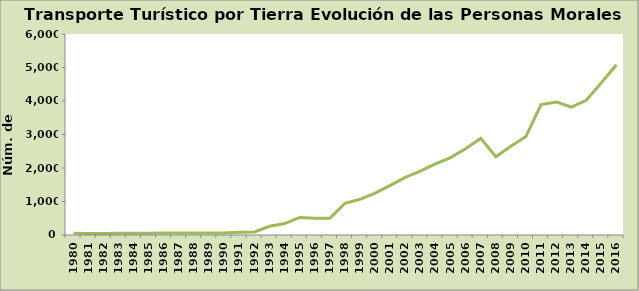
| Category | Series 0 |
|---|---|
| 1980.0 | 50 |
| 1981.0 | 44 |
| 1982.0 | 46 |
| 1983.0 | 54 |
| 1984.0 | 54 |
| 1985.0 | 51 |
| 1986.0 | 56 |
| 1987.0 | 56 |
| 1988.0 | 58 |
| 1989.0 | 60 |
| 1990.0 | 60 |
| 1991.0 | 85 |
| 1992.0 | 90 |
| 1993.0 | 261 |
| 1994.0 | 342 |
| 1995.0 | 523 |
| 1996.0 | 498 |
| 1997.0 | 503 |
| 1998.0 | 948 |
| 1999.0 | 1065 |
| 2000.0 | 1248 |
| 2001.0 | 1483 |
| 2002.0 | 1722 |
| 2003.0 | 1904 |
| 2004.0 | 2120 |
| 2005.0 | 2311 |
| 2006.0 | 2577 |
| 2007.0 | 2888 |
| 2008.0 | 2338 |
| 2009.0 | 2649 |
| 2010.0 | 2942 |
| 2011.0 | 3895 |
| 2012.0 | 3972 |
| 2013.0 | 3820 |
| 2014.0 | 4020 |
| 2015.0 | 4542 |
| 2016.0 | 5080 |